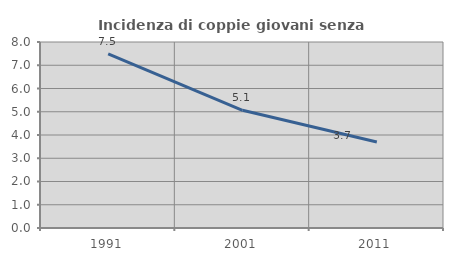
| Category | Incidenza di coppie giovani senza figli |
|---|---|
| 1991.0 | 7.491 |
| 2001.0 | 5.063 |
| 2011.0 | 3.698 |